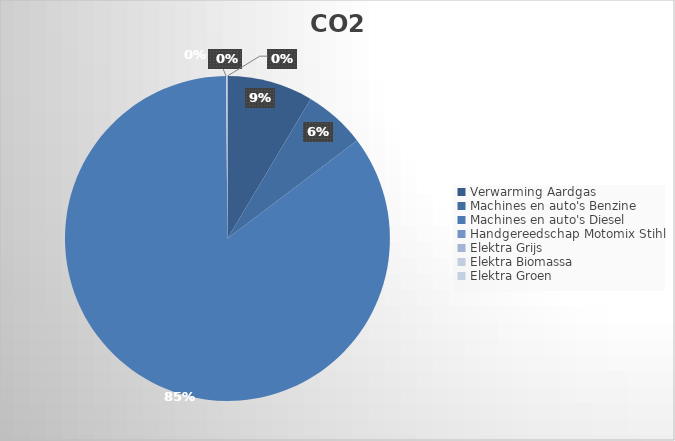
| Category | Ton CO2 | Series 1 |
|---|---|---|
| 0 | 2.373 |  |
| 1 | 1.701 |  |
| 2 | 23.627 |  |
| 3 | 0 |  |
| 4 | 0.004 |  |
| 5 | 0.036 |  |
| 6 | 0 |  |